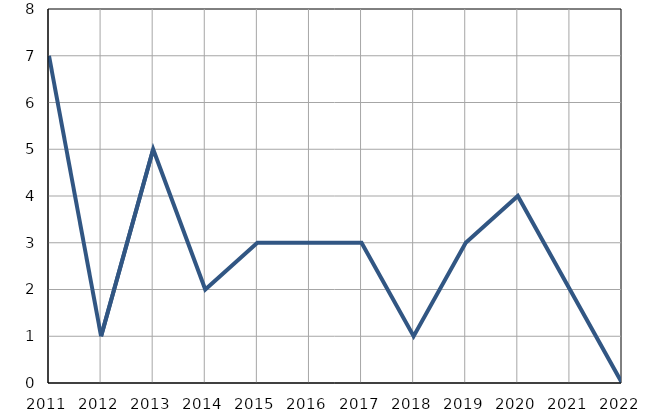
| Category | Умрла 
одојчад |
|---|---|
| 2011.0 | 7 |
| 2012.0 | 1 |
| 2013.0 | 5 |
| 2014.0 | 2 |
| 2015.0 | 3 |
| 2016.0 | 3 |
| 2017.0 | 3 |
| 2018.0 | 1 |
| 2019.0 | 3 |
| 2020.0 | 4 |
| 2021.0 | 2 |
| 2022.0 | 0 |